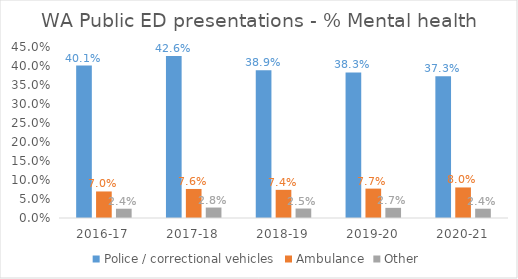
| Category | Police / correctional vehicles | Ambulance | Other |
|---|---|---|---|
| 2016-17 | 0.401 | 0.07 | 0.024 |
| 2017-18 | 0.426 | 0.076 | 0.028 |
| 2018-19 | 0.389 | 0.074 | 0.025 |
| 2019-20 | 0.383 | 0.077 | 0.027 |
| 2020-21 | 0.373 | 0.08 | 0.024 |